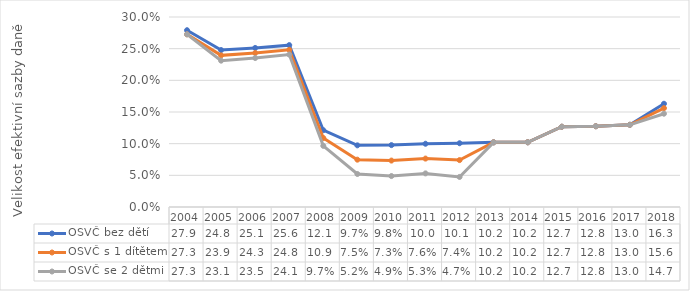
| Category | OSVČ bez dětí | OSVČ s 1 dítětem | OSVČ se 2 dětmi |
|---|---|---|---|
| 2004.0 | 0.279 | 0.273 | 0.273 |
| 2005.0 | 0.248 | 0.239 | 0.231 |
| 2006.0 | 0.251 | 0.243 | 0.235 |
| 2007.0 | 0.256 | 0.248 | 0.241 |
| 2008.0 | 0.121 | 0.109 | 0.097 |
| 2009.0 | 0.097 | 0.075 | 0.052 |
| 2010.0 | 0.098 | 0.073 | 0.049 |
| 2011.0 | 0.1 | 0.076 | 0.053 |
| 2012.0 | 0.101 | 0.074 | 0.047 |
| 2013.0 | 0.102 | 0.102 | 0.102 |
| 2014.0 | 0.102 | 0.102 | 0.102 |
| 2015.0 | 0.127 | 0.127 | 0.127 |
| 2016.0 | 0.128 | 0.128 | 0.128 |
| 2017.0 | 0.13 | 0.13 | 0.13 |
| 2018.0 | 0.163 | 0.156 | 0.147 |